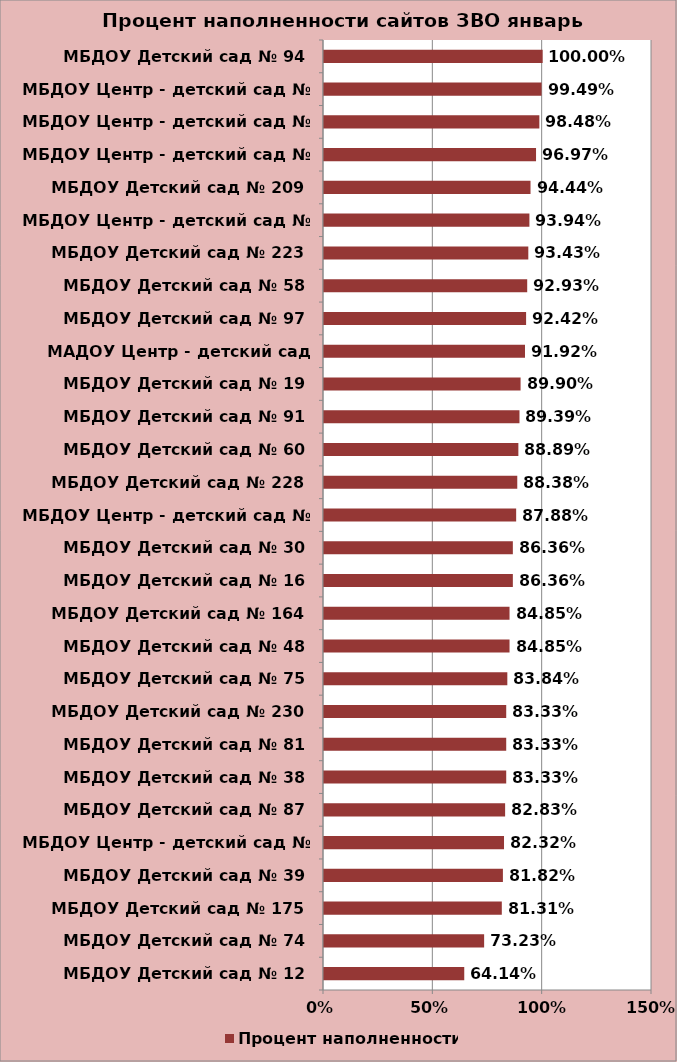
| Category | Процент наполненности |
|---|---|
| МБДОУ Детский сад № 12 | 0.641 |
| МБДОУ Детский сад № 74 | 0.732 |
| МБДОУ Детский сад № 175 | 0.813 |
| МБДОУ Детский сад № 39 | 0.818 |
| МБДОУ Центр - детский сад № 23 | 0.823 |
| МБДОУ Детский сад № 87 | 0.828 |
| МБДОУ Детский сад № 38 | 0.833 |
| МБДОУ Детский сад № 81 | 0.833 |
| МБДОУ Детский сад № 230 | 0.833 |
| МБДОУ Детский сад № 75 | 0.838 |
| МБДОУ Детский сад № 48 | 0.848 |
| МБДОУ Детский сад № 164 | 0.848 |
| МБДОУ Детский сад № 16 | 0.864 |
| МБДОУ Детский сад № 30 | 0.864 |
| МБДОУ Центр - детский сад № 122 | 0.879 |
| МБДОУ Детский сад № 228 | 0.884 |
| МБДОУ Детский сад № 60 | 0.889 |
| МБДОУ Детский сад № 91 | 0.894 |
| МБДОУ Детский сад № 19 | 0.899 |
| МАДОУ Центр - детский сад №134 | 0.919 |
| МБДОУ Детский сад № 97 | 0.924 |
| МБДОУ Детский сад № 58 | 0.929 |
| МБДОУ Детский сад № 223 | 0.934 |
| МБДОУ Центр - детский сад № 46 | 0.939 |
| МБДОУ Детский сад № 209 | 0.944 |
| МБДОУ Центр - детский сад № 115 | 0.97 |
| МБДОУ Центр - детский сад № 232 | 0.985 |
| МБДОУ Центр - детский сад № 233 | 0.995 |
| МБДОУ Детский сад № 94 | 1 |